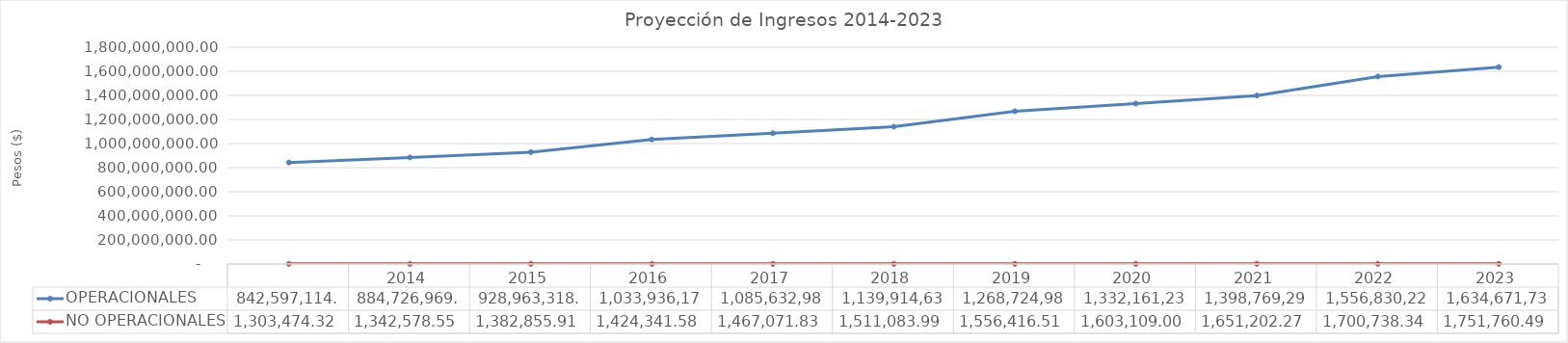
| Category | OPERACIONALES | NO OPERACIONALES |
|---|---|---|
| nan | 842597114.235 | 1303474.32 |
| 2014.0 | 884726969.947 | 1342578.55 |
| 2015.0 | 928963318.444 | 1382855.906 |
| 2016.0 | 1033936173.428 | 1424341.583 |
| 2017.0 | 1085632982.1 | 1467071.831 |
| 2018.0 | 1139914631.205 | 1511083.986 |
| 2019.0 | 1268724984.531 | 1556416.505 |
| 2020.0 | 1332161233.757 | 1603109 |
| 2021.0 | 1398769295.445 | 1651202.27 |
| 2022.0 | 1556830225.831 | 1700738.339 |
| 2023.0 | 1634671737.122 | 1751760.489 |